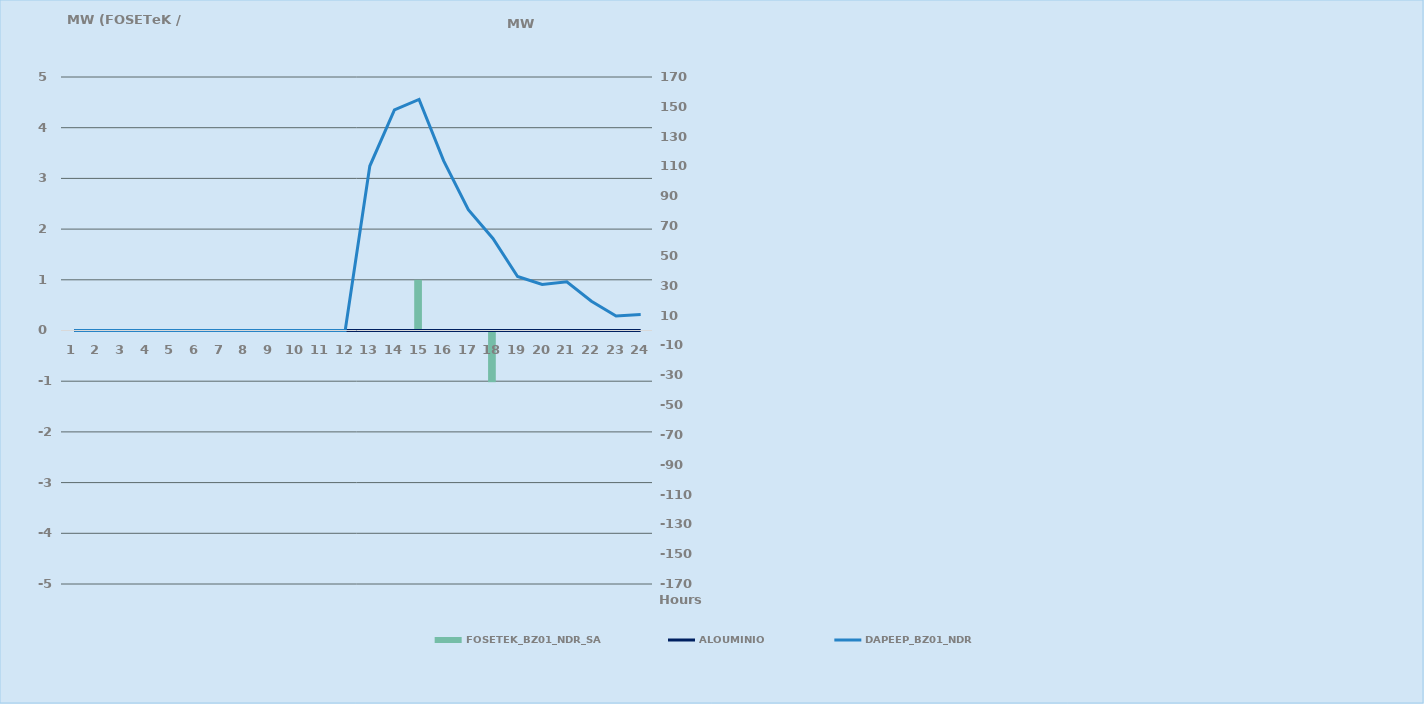
| Category | FOSETEK_BZ01_NDR_SA |
|---|---|
| 0 | 0 |
| 1 | 0 |
| 2 | 0 |
| 3 | 0 |
| 4 | 0 |
| 5 | 0 |
| 6 | 0 |
| 7 | 0 |
| 8 | 0 |
| 9 | 0 |
| 10 | 0 |
| 11 | 0 |
| 12 | 0 |
| 13 | 0 |
| 14 | 1 |
| 15 | 0 |
| 16 | 0 |
| 17 | -1 |
| 18 | 0 |
| 19 | 0 |
| 20 | 0 |
| 21 | 0 |
| 22 | 0 |
| 23 | 0 |